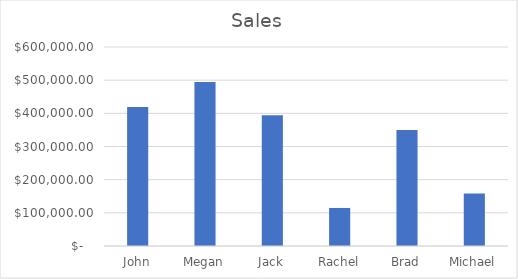
| Category | Sales |
|---|---|
| John | 419443 |
| Megan | 494694 |
| Jack | 394581 |
| Rachel | 114668 |
| Brad | 349648 |
| Michael | 158057 |